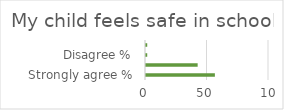
| Category | Series 1 |
|---|---|
| Strongly agree % | 56 |
| Agree % | 42 |
| Disagree % | 1 |
| Strongly disagree % | 1 |